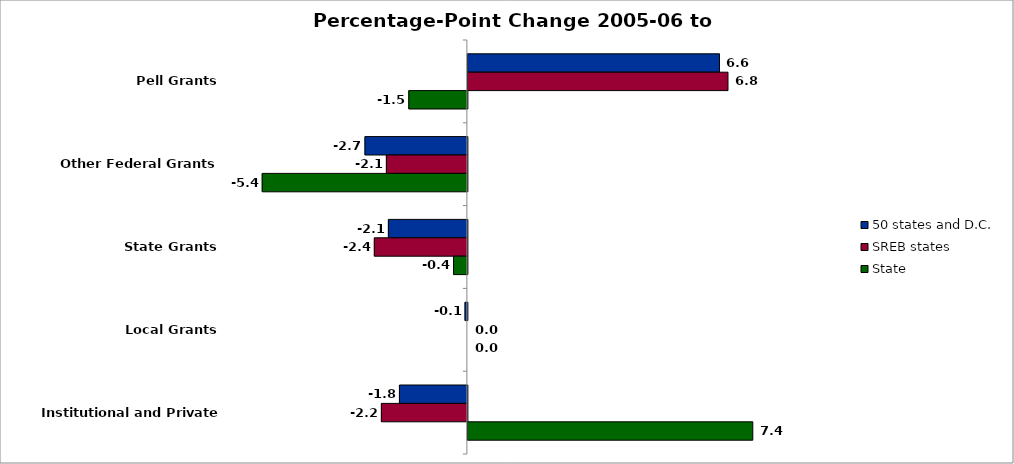
| Category | 50 states and D.C. | SREB states | State |
|---|---|---|---|
| Pell Grants | 6.567 | 6.789 | -1.529 |
| Other Federal Grants | -2.672 | -2.114 | -5.355 |
| State Grants | -2.061 | -2.428 | -0.361 |
| Local Grants | -0.061 | 0 | 0 |
| Institutional and Private Grants | -1.773 | -2.244 | 7.437 |